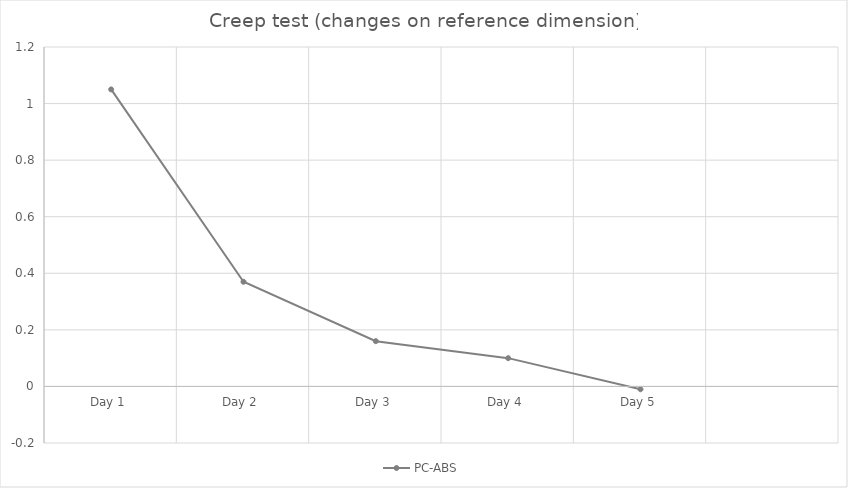
| Category | PC-ABS |
|---|---|
| Day 1 | 1.05 |
| Day 2 | 0.37 |
| Day 3 | 0.16 |
| Day 4 | 0.1 |
| Day 5 | -0.01 |